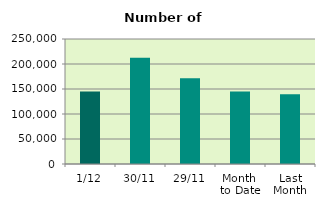
| Category | Series 0 |
|---|---|
| 1/12 | 144916 |
| 30/11 | 212338 |
| 29/11 | 171692 |
| Month 
to Date | 144916 |
| Last
Month | 139642.182 |